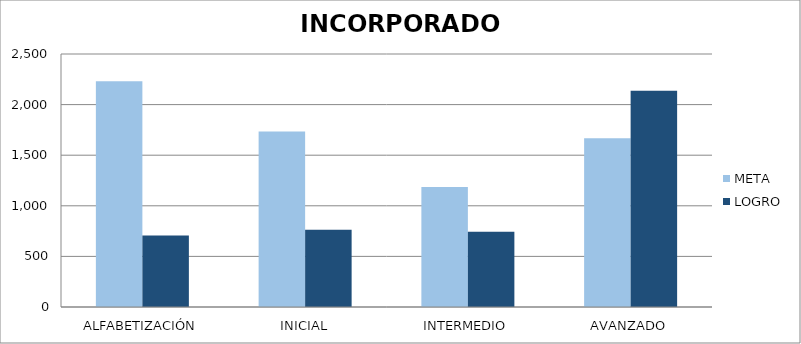
| Category | META | LOGRO |
|---|---|---|
| ALFABETIZACIÓN | 2230 | 707 |
| INICIAL | 1734 | 763 |
| INTERMEDIO | 1186 | 744 |
| AVANZADO | 1668 | 2136 |